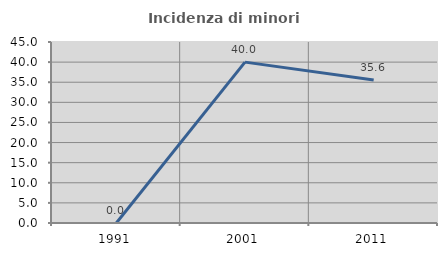
| Category | Incidenza di minori stranieri |
|---|---|
| 1991.0 | 0 |
| 2001.0 | 40 |
| 2011.0 | 35.556 |